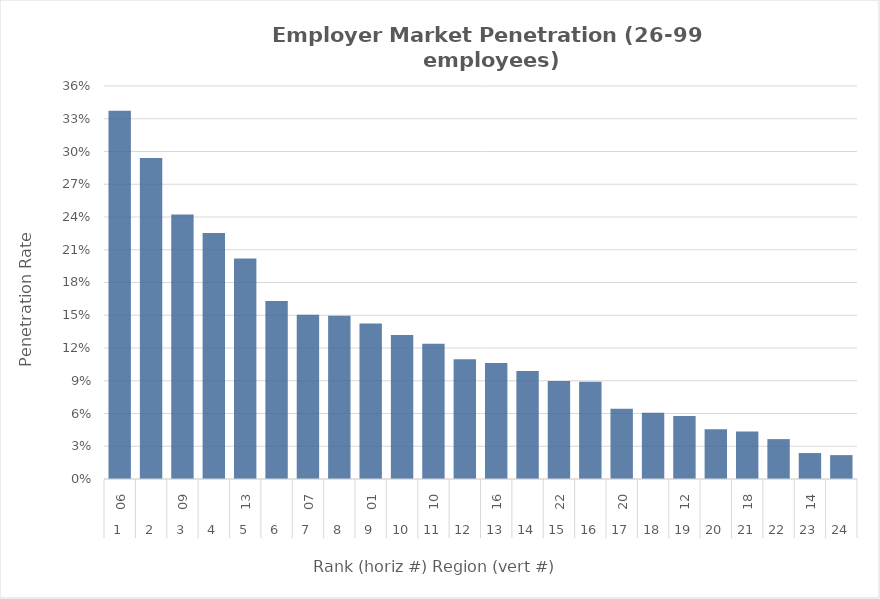
| Category | Rate |
|---|---|
| 0 | 0.337 |
| 1 | 0.294 |
| 2 | 0.242 |
| 3 | 0.225 |
| 4 | 0.202 |
| 5 | 0.163 |
| 6 | 0.151 |
| 7 | 0.15 |
| 8 | 0.142 |
| 9 | 0.132 |
| 10 | 0.124 |
| 11 | 0.11 |
| 12 | 0.106 |
| 13 | 0.099 |
| 14 | 0.09 |
| 15 | 0.089 |
| 16 | 0.064 |
| 17 | 0.061 |
| 18 | 0.058 |
| 19 | 0.046 |
| 20 | 0.044 |
| 21 | 0.037 |
| 22 | 0.024 |
| 23 | 0.022 |